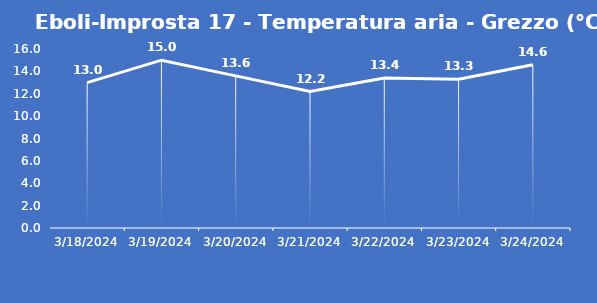
| Category | Eboli-Improsta 17 - Temperatura aria - Grezzo (°C) |
|---|---|
| 3/18/24 | 13 |
| 3/19/24 | 15 |
| 3/20/24 | 13.6 |
| 3/21/24 | 12.2 |
| 3/22/24 | 13.4 |
| 3/23/24 | 13.3 |
| 3/24/24 | 14.6 |